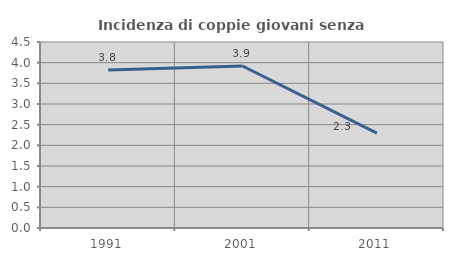
| Category | Incidenza di coppie giovani senza figli |
|---|---|
| 1991.0 | 3.824 |
| 2001.0 | 3.92 |
| 2011.0 | 2.296 |